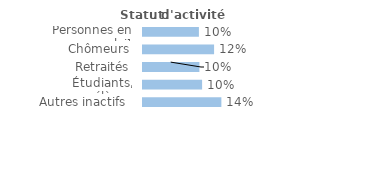
| Category | Series 0 |
|---|---|
| Personnes en emploi¹ | 0.098 |
| Chômeurs | 0.124 |
| Retraités | 0.098 |
| Étudiants, élèves | 0.103 |
| Autres inactifs  | 0.137 |